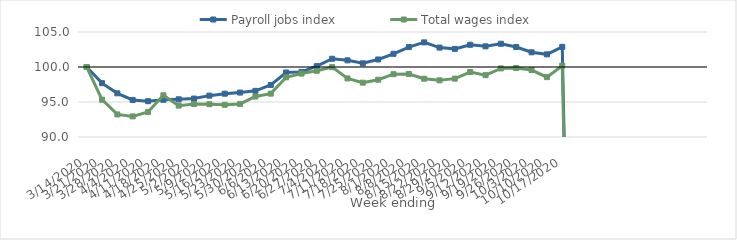
| Category | Payroll jobs index | Total wages index |
|---|---|---|
| 14/03/2020 | 100 | 100 |
| 21/03/2020 | 97.693 | 95.33 |
| 28/03/2020 | 96.241 | 93.222 |
| 04/04/2020 | 95.296 | 92.944 |
| 11/04/2020 | 95.114 | 93.584 |
| 18/04/2020 | 95.31 | 95.954 |
| 25/04/2020 | 95.386 | 94.483 |
| 02/05/2020 | 95.49 | 94.713 |
| 09/05/2020 | 95.907 | 94.687 |
| 16/05/2020 | 96.187 | 94.601 |
| 23/05/2020 | 96.346 | 94.719 |
| 30/05/2020 | 96.591 | 95.783 |
| 06/06/2020 | 97.441 | 96.193 |
| 13/06/2020 | 99.217 | 98.524 |
| 20/06/2020 | 99.302 | 99.062 |
| 27/06/2020 | 100.119 | 99.459 |
| 04/07/2020 | 101.178 | 99.978 |
| 11/07/2020 | 100.952 | 98.369 |
| 18/07/2020 | 100.528 | 97.762 |
| 25/07/2020 | 101.076 | 98.184 |
| 01/08/2020 | 101.881 | 98.973 |
| 08/08/2020 | 102.849 | 99.008 |
| 15/08/2020 | 103.519 | 98.327 |
| 22/08/2020 | 102.771 | 98.095 |
| 29/08/2020 | 102.591 | 98.34 |
| 05/09/2020 | 103.176 | 99.286 |
| 12/09/2020 | 102.952 | 98.832 |
| 19/09/2020 | 103.32 | 99.797 |
| 26/09/2020 | 102.86 | 99.86 |
| 03/10/2020 | 102.102 | 99.561 |
| 10/10/2020 | 101.807 | 98.55 |
| 17/10/2020 | 102.879 | 100.186 |